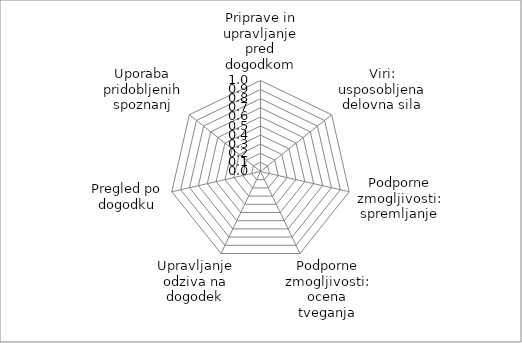
| Category | Series 0 |
|---|---|
| Priprave in upravljanje pred dogodkom | 0 |
| Viri: usposobljena delovna sila | 0 |
| Podporne zmogljivosti: spremljanje | 0 |
| Podporne zmogljivosti: ocena tveganja | 0 |
| Upravljanje odziva na dogodek | 0 |
| Pregled po dogodku | 0 |
| Uporaba pridobljenih spoznanj | 0 |